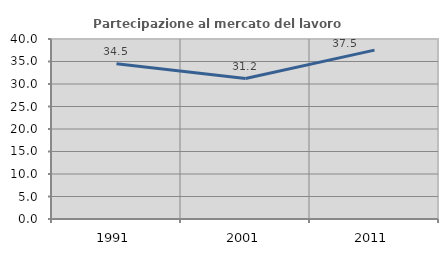
| Category | Partecipazione al mercato del lavoro  femminile |
|---|---|
| 1991.0 | 34.483 |
| 2001.0 | 31.209 |
| 2011.0 | 37.526 |